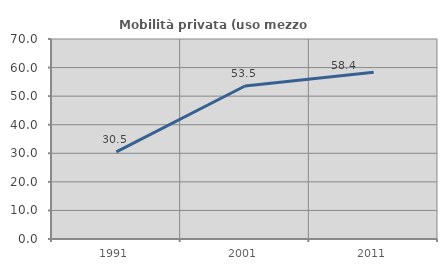
| Category | Mobilità privata (uso mezzo privato) |
|---|---|
| 1991.0 | 30.496 |
| 2001.0 | 53.543 |
| 2011.0 | 58.383 |